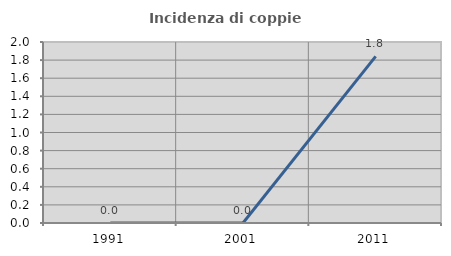
| Category | Incidenza di coppie miste |
|---|---|
| 1991.0 | 0 |
| 2001.0 | 0 |
| 2011.0 | 1.842 |